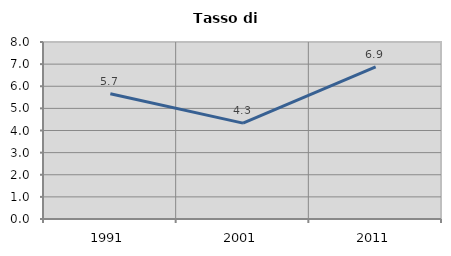
| Category | Tasso di disoccupazione   |
|---|---|
| 1991.0 | 5.663 |
| 2001.0 | 4.333 |
| 2011.0 | 6.878 |